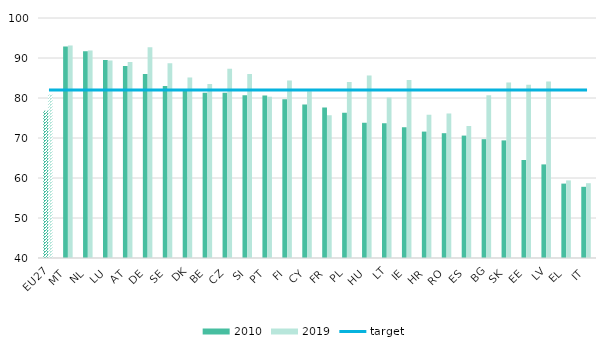
| Category | 2010 | 2019 |
|---|---|---|
| EU27 | 76.8 | 80.9 |
| MT | 92.9 | 93.1 |
| NL | 91.7 | 91.9 |
| LU | 89.5 | 89.4 |
| AT | 88 | 89 |
| DE | 86 | 92.7 |
| SE | 83 | 88.7 |
| DK | 81.8 | 85.1 |
| BE | 81.3 | 83.5 |
| CZ | 81.3 | 87.3 |
| SI | 80.7 | 86 |
| PT | 80.6 | 80.3 |
| FI | 79.7 | 84.4 |
| CY | 78.4 | 81.7 |
| FR | 77.6 | 75.7 |
| PL | 76.3 | 84 |
| HU | 73.8 | 85.6 |
| LT | 73.7 | 80.1 |
| IE | 72.7 | 84.5 |
| HR | 71.6 | 75.8 |
| RO | 71.2 | 76.1 |
| ES | 70.6 | 73 |
| BG | 69.7 | 80.7 |
| SK | 69.4 | 83.9 |
| EE | 64.5 | 83.3 |
| LV | 63.4 | 84.1 |
| EL | 58.6 | 59.4 |
| IT | 57.8 | 58.7 |